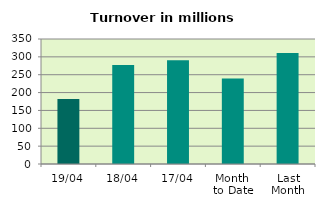
| Category | Series 0 |
|---|---|
| 19/04 | 182.002 |
| 18/04 | 277.009 |
| 17/04 | 290.782 |
| Month 
to Date | 239.134 |
| Last
Month | 310.688 |